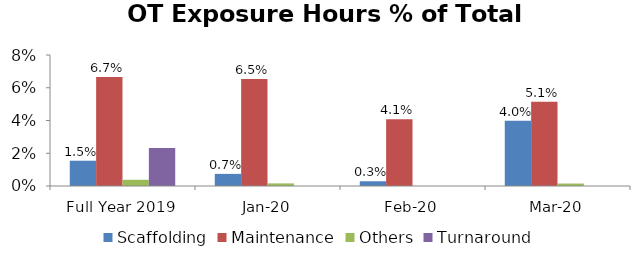
| Category | Scaffolding | Maintenance | Others | Turnaround |
|---|---|---|---|---|
| Full Year 2019 | 0.015 | 0.067 | 0.004 | 0.023 |
| Jan-20 | 0.007 | 0.065 | 0.002 | 0 |
| Feb-20 | 0.003 | 0.041 | 0 | 0 |
| Mar-20 | 0.04 | 0.051 | 0.002 | 0 |